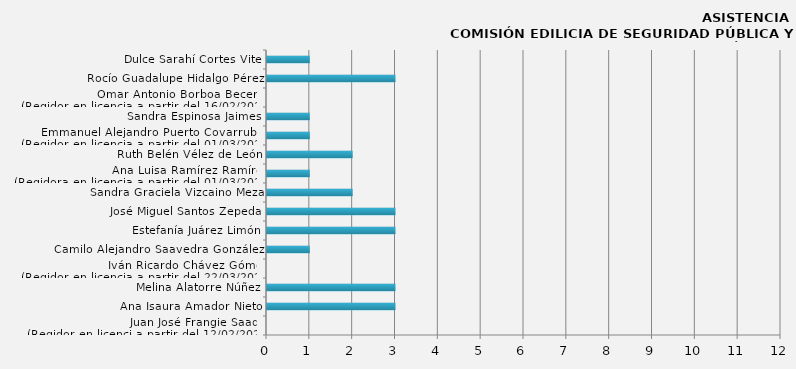
| Category | Series 0 |
|---|---|
| Juan José Frangie Saade
(Regidor en licenci a partir del 12/02/2024) | 0 |
| Ana Isaura Amador Nieto | 3 |
| Melina Alatorre Núñez | 3 |
| Iván Ricardo Chávez Gómez
(Regidor en licencia a partir del 22/03/2024) | 0 |
| Camilo Alejandro Saavedra González  | 1 |
| Estefanía Juárez Limón | 3 |
| José Miguel Santos Zepeda | 3 |
| Sandra Graciela Vizcaino Meza | 2 |
| Ana Luisa Ramírez Ramírez
(Regidora en licencia a partir del 01/03/2024) | 1 |
| Ruth Belén Vélez de León | 2 |
| Emmanuel Alejandro Puerto Covarrubias
(Regidor en licencia a partir del 01/03/2024) | 1 |
| Sandra Espinosa Jaimes | 1 |
| Omar Antonio Borboa Becerra
(Regidor en licencia a partir del 16/02/2024) | 0 |
| Rocío Guadalupe Hidalgo Pérez | 3 |
| Dulce Sarahí Cortes Vite | 1 |